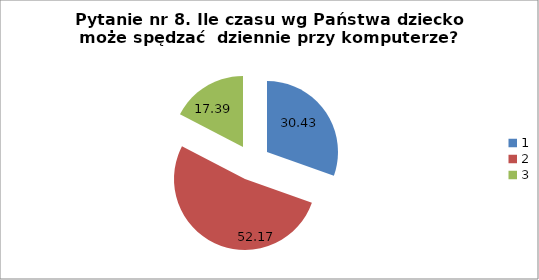
| Category | % |
|---|---|
| 0 | 30.435 |
| 1 | 52.174 |
| 2 | 17.391 |